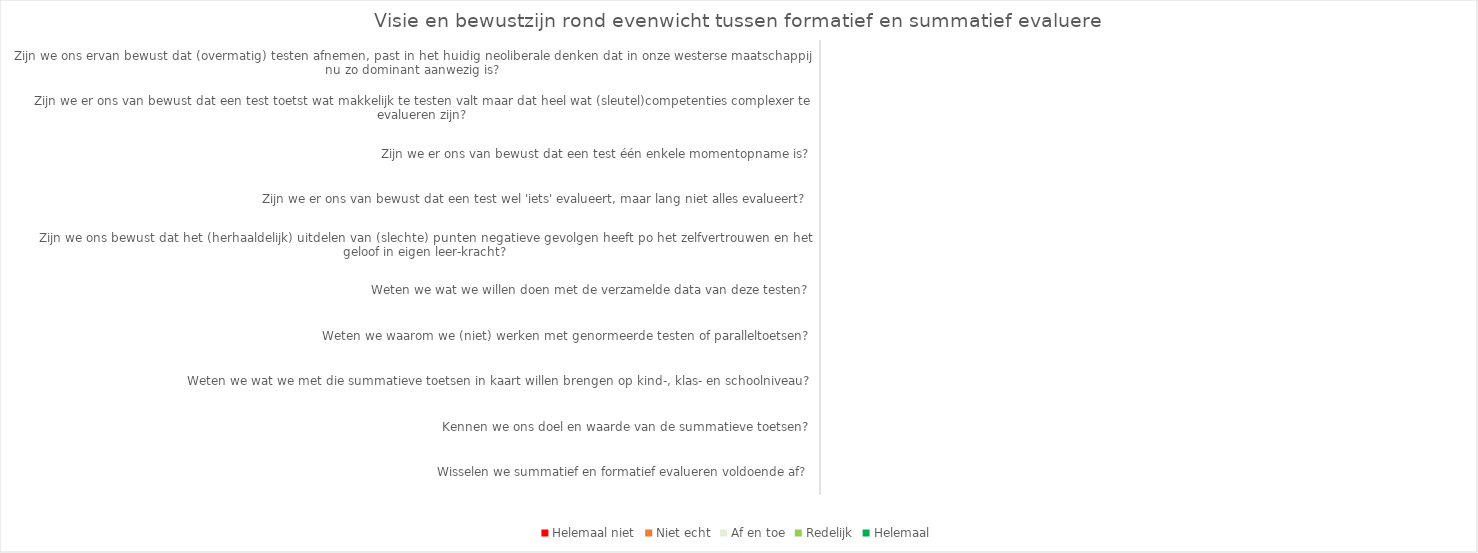
| Category | Helemaal niet | Niet echt | Af en toe | Redelijk | Helemaal |
|---|---|---|---|---|---|
| Wisselen we summatief en formatief evalueren voldoende af? | 0 | 0 | 0 | 0 | 0 |
| Kennen we ons doel en waarde van de summatieve toetsen? | 0 | 0 | 0 | 0 | 0 |
| Weten we wat we met die summatieve toetsen in kaart willen brengen op kind-, klas- en schoolniveau? | 0 | 0 | 0 | 0 | 0 |
| Weten we waarom we (niet) werken met genormeerde testen of paralleltoetsen? | 0 | 0 | 0 | 0 | 0 |
| Weten we wat we willen doen met de verzamelde data van deze testen? | 0 | 0 | 0 | 0 | 0 |
| Zijn we ons bewust dat het (herhaaldelijk) uitdelen van (slechte) punten negatieve gevolgen heeft po het zelfvertrouwen en het geloof in eigen leer-kracht? | 0 | 0 | 0 | 0 | 0 |
| Zijn we er ons van bewust dat een test wel 'iets' evalueert, maar lang niet alles evalueert? | 0 | 0 | 0 | 0 | 0 |
| Zijn we er ons van bewust dat een test één enkele momentopname is? | 0 | 0 | 0 | 0 | 0 |
| Zijn we er ons van bewust dat een test toetst wat makkelijk te testen valt maar dat heel wat (sleutel)competenties complexer te evalueren zijn? | 0 | 0 | 0 | 0 | 0 |
| Zijn we ons ervan bewust dat (overmatig) testen afnemen, past in het huidig neoliberale denken dat in onze westerse maatschappij nu zo dominant aanwezig is? | 0 | 0 | 0 | 0 | 0 |